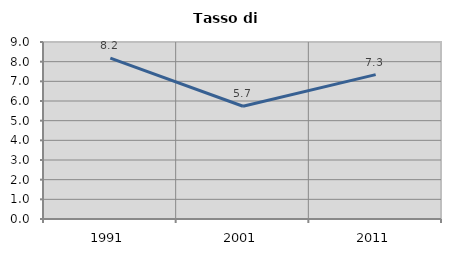
| Category | Tasso di disoccupazione   |
|---|---|
| 1991.0 | 8.18 |
| 2001.0 | 5.734 |
| 2011.0 | 7.342 |